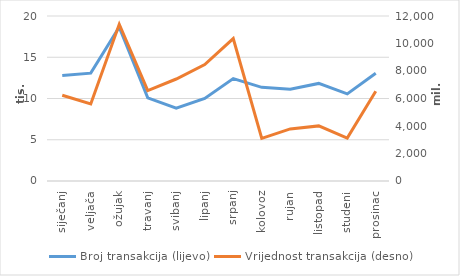
| Category | Broj transakcija (lijevo) |
|---|---|
| siječanj | 12800 |
| veljača | 13074 |
| ožujak | 18658 |
| travanj | 10070 |
| svibanj | 8817 |
| lipanj | 10013 |
| srpanj | 12413 |
| kolovoz | 11352 |
| rujan | 11115 |
| listopad | 11828 |
| studeni | 10560 |
| prosinac | 13069 |